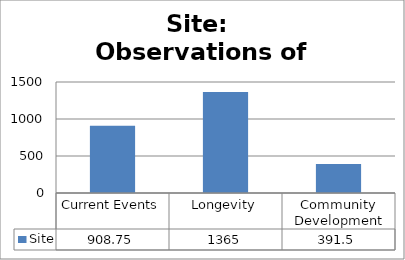
| Category | Site |
|---|---|
| Current Events | 908.75 |
| Longevity | 1365 |
| Community Development | 391.5 |